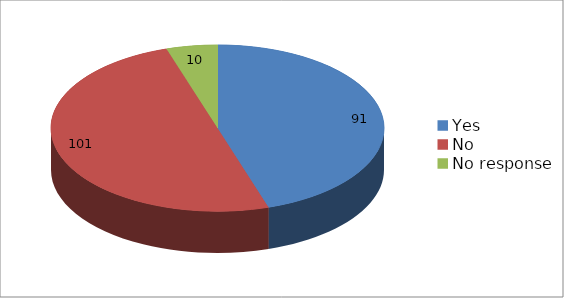
| Category | Series 0 |
|---|---|
| Yes  | 91 |
| No | 101 |
| No response | 10 |